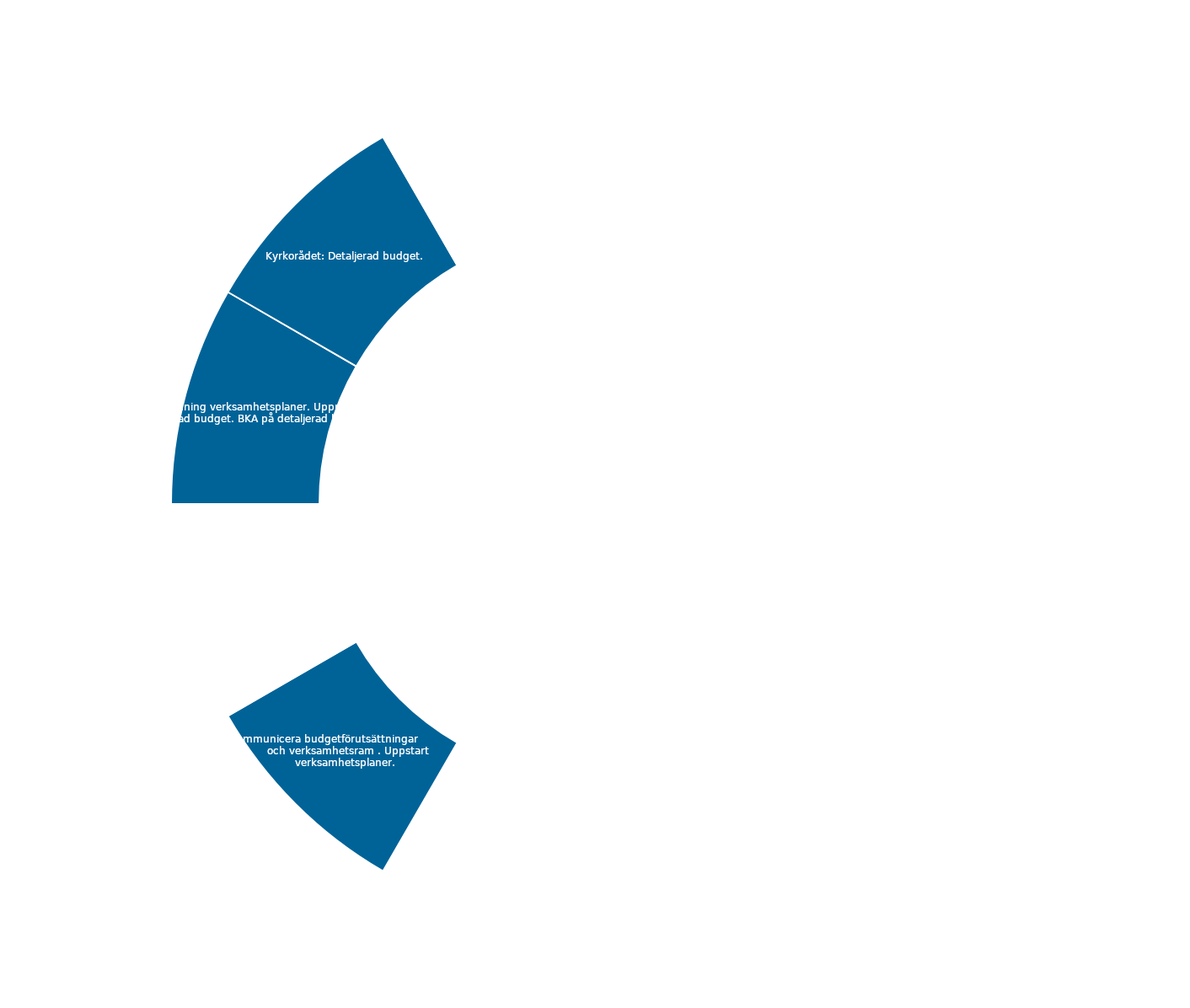
| Category | Series 0 |
|---|---|
|  | 1 |
|  | 1 |
|  | 1 |
|  | 1 |
|  | 1 |
|  | 1 |
|  | 1 |
| Kommunicera budgetförutsättningar                och verksamhetsram . Uppstart verksamhetsplaner.  | 1 |
|  | 1 |
| Inlämning verksamhetsplaner. Upprätta detaljerad budget. BKA på detaljerad budget.  | 1 |
| Kyrkorådet: Detaljerad budget.  | 1 |